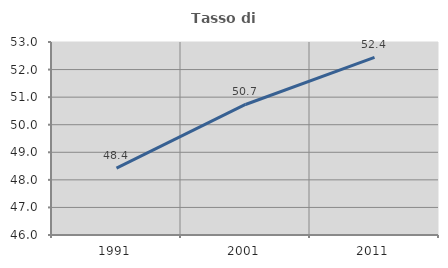
| Category | Tasso di occupazione   |
|---|---|
| 1991.0 | 48.428 |
| 2001.0 | 50.734 |
| 2011.0 | 52.44 |